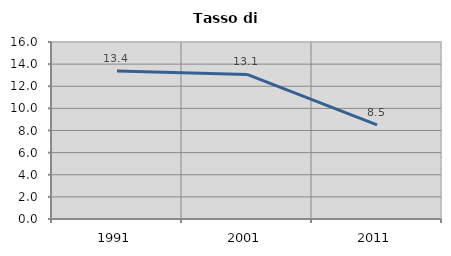
| Category | Tasso di disoccupazione   |
|---|---|
| 1991.0 | 13.374 |
| 2001.0 | 13.07 |
| 2011.0 | 8.503 |